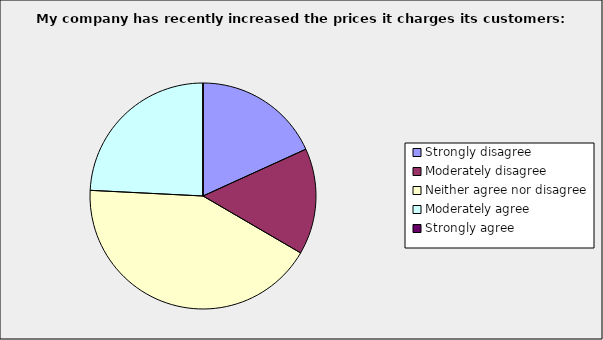
| Category | Series 0 |
|---|---|
| Strongly disagree | 0.182 |
| Moderately disagree | 0.152 |
| Neither agree nor disagree | 0.424 |
| Moderately agree | 0.242 |
| Strongly agree | 0 |